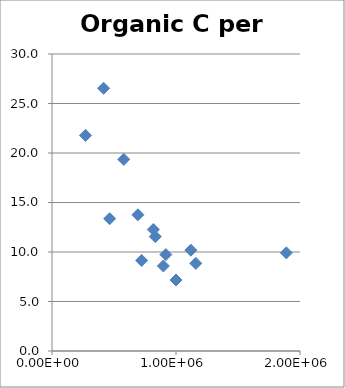
| Category | Series 0 |
|---|---|
| 1000000.0 | 7.173 |
| 723000.0 | 9.147 |
| 918000.0 | 9.739 |
| 579000.0 | 19.355 |
| 817000.0 | 12.273 |
| 898000.0 | 8.589 |
| 1890000.0 | 9.912 |
| 270000.0 | 21.778 |
| 465000.0 | 13.362 |
| 833000.0 | 11.557 |
| 1160000.0 | 8.851 |
| 1120000.0 | 10.185 |
| 693000.0 | 13.757 |
| 416000.0 | 26.538 |